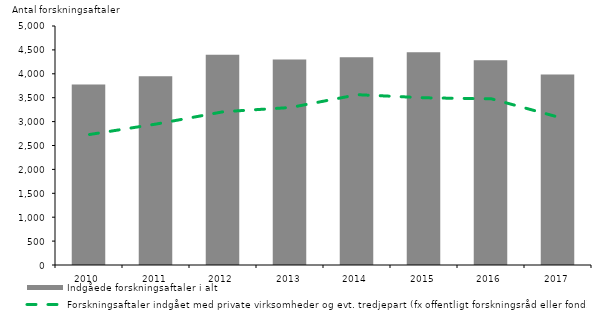
| Category | Indgåede forskningsaftaler i alt |
|---|---|
| 2010.0 | 3778 |
| 2011.0 | 3948 |
| 2012.0 | 4399 |
| 2013.0 | 4297 |
| 2014.0 | 4345 |
| 2015.0 | 4451 |
| 2016.0 | 4283 |
| 2017.0 | 3984 |